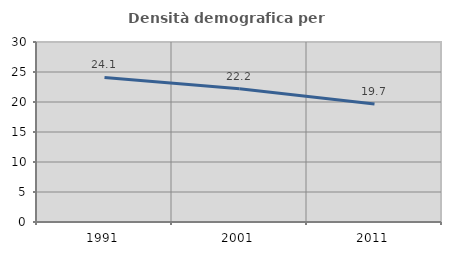
| Category | Densità demografica |
|---|---|
| 1991.0 | 24.091 |
| 2001.0 | 22.214 |
| 2011.0 | 19.666 |